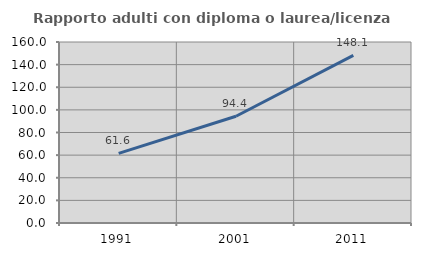
| Category | Rapporto adulti con diploma o laurea/licenza media  |
|---|---|
| 1991.0 | 61.576 |
| 2001.0 | 94.378 |
| 2011.0 | 148.117 |